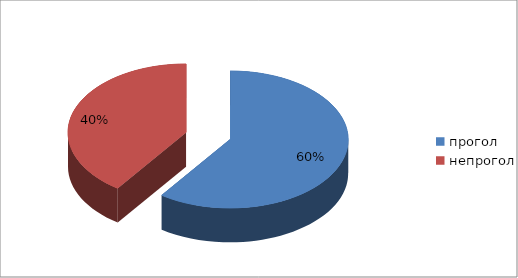
| Category | Series 0 |
|---|---|
| прогол | 67 |
| непрогол | 45 |